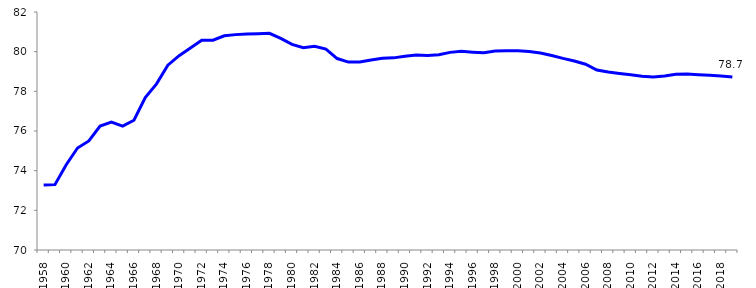
| Category | Part du Public |
|---|---|
| 1958.0 | 73.274 |
| 1959.0 | 73.295 |
| 1960.0 | 74.298 |
| 1961.0 | 75.142 |
| 1962.0 | 75.498 |
| 1963.0 | 76.245 |
| 1964.0 | 76.445 |
| 1965.0 | 76.244 |
| 1966.0 | 76.542 |
| 1967.0 | 77.691 |
| 1968.0 | 78.376 |
| 1969.0 | 79.322 |
| 1970.0 | 79.798 |
| 1971.0 | 80.182 |
| 1972.0 | 80.579 |
| 1973.0 | 80.579 |
| 1974.0 | 80.803 |
| 1975.0 | 80.859 |
| 1976.0 | 80.893 |
| 1977.0 | 80.903 |
| 1978.0 | 80.924 |
| 1979.0 | 80.669 |
| 1980.0 | 80.364 |
| 1981.0 | 80.202 |
| 1982.0 | 80.268 |
| 1983.0 | 80.127 |
| 1984.0 | 79.654 |
| 1985.0 | 79.475 |
| 1986.0 | 79.48 |
| 1987.0 | 79.577 |
| 1988.0 | 79.662 |
| 1989.0 | 79.687 |
| 1990.0 | 79.764 |
| 1991.0 | 79.827 |
| 1992.0 | 79.804 |
| 1993.0 | 79.843 |
| 1994.0 | 79.964 |
| 1995.0 | 80.016 |
| 1996.0 | 79.975 |
| 1997.0 | 79.945 |
| 1998.0 | 80.028 |
| 1999.0 | 80.05 |
| 2000.0 | 80.047 |
| 2001.0 | 80.008 |
| 2002.0 | 79.936 |
| 2003.0 | 79.809 |
| 2004.0 | 79.66 |
| 2005.0 | 79.531 |
| 2006.0 | 79.367 |
| 2007.0 | 79.072 |
| 2008.0 | 78.977 |
| 2009.0 | 78.903 |
| 2010.0 | 78.833 |
| 2011.0 | 78.762 |
| 2012.0 | 78.721 |
| 2013.0 | 78.777 |
| 2014.0 | 78.858 |
| 2015.0 | 78.869 |
| 2016.0 | 78.841 |
| 2017.0 | 78.812 |
| 2018.0 | 78.768 |
| 2019.0 | 78.719 |